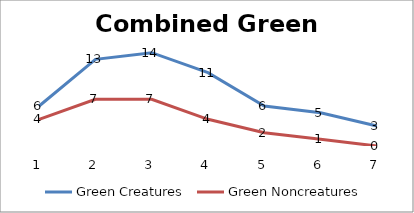
| Category | Green Creatures | Green Noncreatures |
|---|---|---|
| 0 | 6 | 4 |
| 1 | 13 | 7 |
| 2 | 14 | 7 |
| 3 | 11 | 4 |
| 4 | 6 | 2 |
| 5 | 5 | 1 |
| 6 | 3 | 0 |